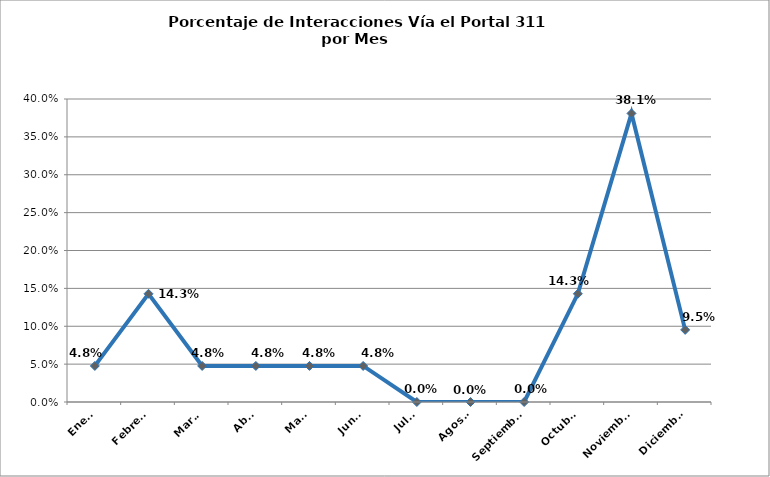
| Category | Series 0 |
|---|---|
| Enero | 0.048 |
| Febrero | 0.143 |
| Marzo | 0.048 |
| Abril | 0.048 |
| Mayo | 0.048 |
| Junio | 0.048 |
| Julio | 0 |
| Agosto | 0 |
| Septiembre | 0 |
| Octubre | 0.143 |
| Noviembre | 0.381 |
| Diciembre | 0.095 |